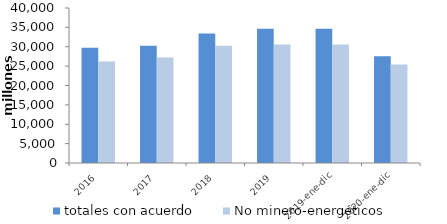
| Category | totales con acuerdo | No minero-energéticos |
|---|---|---|
| 2016 | 29754.741 | 26174.107 |
| 2017 | 30256.79 | 27193.777 |
| 2018 | 33423.013 | 30290.24 |
| 2019 | 34628.129 | 30601.001 |
| 2019-ene-dic | 34628.129 | 30601.001 |
| 2020-ene-dic | 27543.49 | 25444.323 |